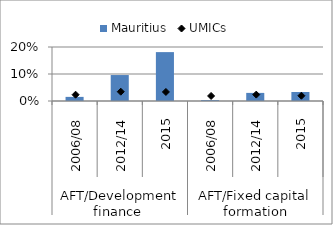
| Category | Mauritius |
|---|---|
| 0 | 0.015 |
| 1 | 0.096 |
| 2 | 0.181 |
| 3 | 0.003 |
| 4 | 0.03 |
| 5 | 0.033 |